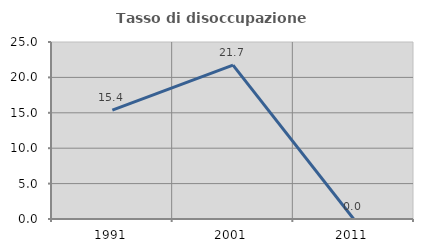
| Category | Tasso di disoccupazione giovanile  |
|---|---|
| 1991.0 | 15.385 |
| 2001.0 | 21.739 |
| 2011.0 | 0 |